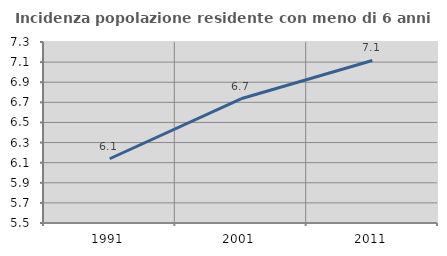
| Category | Incidenza popolazione residente con meno di 6 anni |
|---|---|
| 1991.0 | 6.139 |
| 2001.0 | 6.735 |
| 2011.0 | 7.116 |